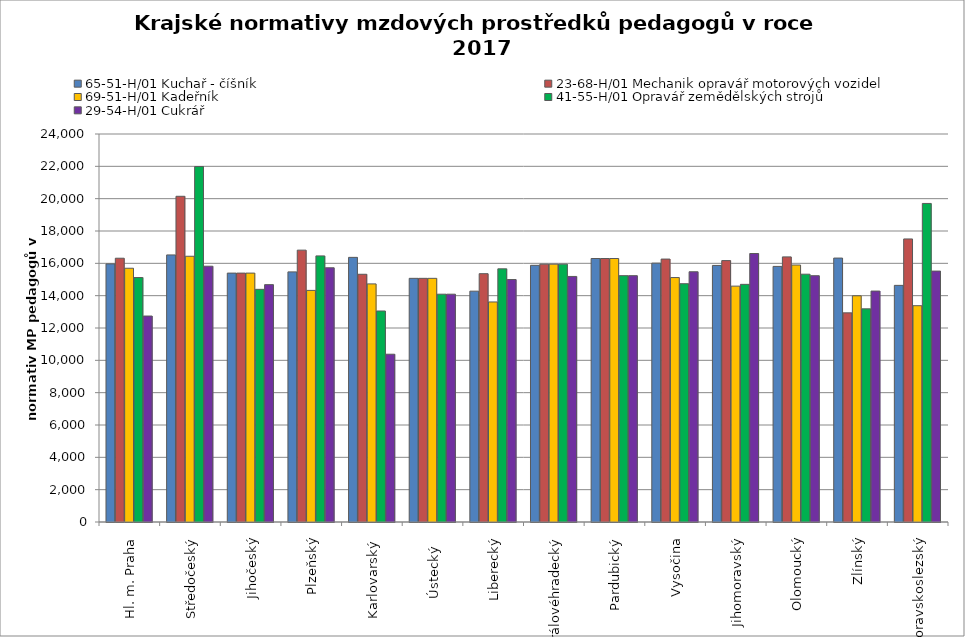
| Category | 65-51-H/01 Kuchař - číšník | 23-68-H/01 Mechanik opravář motorových vozidel | 69-51-H/01 Kadeřník | 41-55-H/01 Opravář zemědělských strojů | 29-54-H/01 Cukrář |
|---|---|---|---|---|---|
| Hl. m. Praha | 15965.665 | 16315.789 | 15696.203 | 15121.951 | 12739.726 |
| Středočeský | 16519.93 | 20147.449 | 16437.331 | 21987.702 | 15821.542 |
| Jihočeský | 15395.542 | 15395.542 | 15395.542 | 14391.214 | 14682.727 |
| Plzeňský | 15471.251 | 16815.669 | 14325.892 | 16459.938 | 15725.305 |
| Karlovarský  | 16368.876 | 15323.741 | 14727.744 | 13052.47 | 10377.588 |
| Ústecký   | 15072.355 | 15072.355 | 15072.355 | 14090.842 | 14090.842 |
| Liberecký | 14278.111 | 15360.437 | 13611.104 | 15659.716 | 14998.058 |
| Královéhradecký | 15877.333 | 15948.214 | 15948.214 | 15948.214 | 15188.776 |
| Pardubický | 16298.524 | 16298.524 | 16298.524 | 15237.257 | 15237.257 |
| Vysočina | 16012.276 | 16264.028 | 15120.464 | 14739.109 | 15478.695 |
| Jihomoravský | 15868.94 | 16169.323 | 14590.168 | 14699.864 | 16607.58 |
| Olomoucký | 15809.285 | 16399.132 | 15895.711 | 15328.467 | 15235.792 |
| Zlínský | 16325.143 | 12936.906 | 13992.98 | 13185.692 | 14284.5 |
| Moravskoslezský | 14636.943 | 17508.571 | 13379.913 | 19704.18 | 15520.473 |